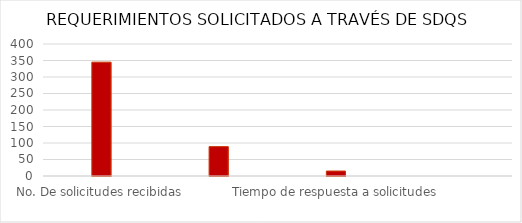
| Category | Series 0 |
|---|---|
| No. De solicitudes recibidas | 345 |
| No. De solicitudes trasladadas a otra entidad | 89 |
| Tiempo de respuesta a solicitudes | 15 |
| No. De Solicitudes en las que se negó el acceso a la información  | 0 |